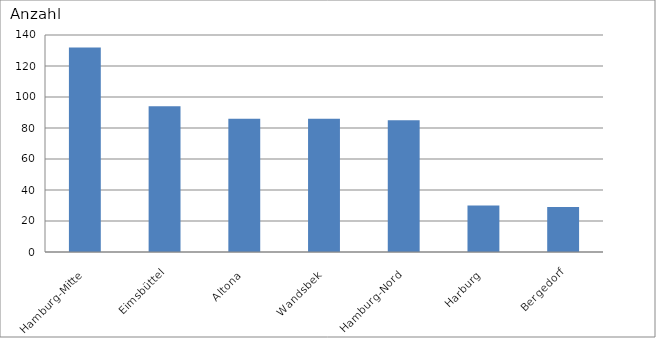
| Category | Hamburg-Mitte |
|---|---|
| Hamburg-Mitte | 132 |
| Eimsbüttel | 94 |
| Altona | 86 |
| Wandsbek | 86 |
| Hamburg-Nord | 85 |
| Harburg | 30 |
| Bergedorf | 29 |